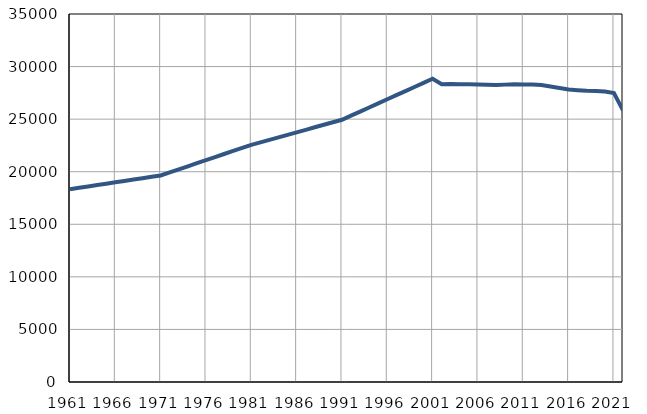
| Category | Број
становника |
|---|---|
| 1961.0 | 18336 |
| 1962.0 | 18467 |
| 1963.0 | 18597 |
| 1964.0 | 18728 |
| 1965.0 | 18859 |
| 1966.0 | 18990 |
| 1967.0 | 19120 |
| 1968.0 | 19251 |
| 1969.0 | 19382 |
| 1970.0 | 19512 |
| 1971.0 | 19643 |
| 1972.0 | 19934 |
| 1973.0 | 20226 |
| 1974.0 | 20516 |
| 1975.0 | 20809 |
| 1976.0 | 21100 |
| 1977.0 | 21391 |
| 1978.0 | 21683 |
| 1979.0 | 21974 |
| 1980.0 | 22266 |
| 1981.0 | 22557 |
| 1982.0 | 22795 |
| 1983.0 | 23033 |
| 1984.0 | 23272 |
| 1985.0 | 23510 |
| 1986.0 | 23748 |
| 1987.0 | 23986 |
| 1988.0 | 24225 |
| 1989.0 | 24463 |
| 1990.0 | 24701 |
| 1991.0 | 24939 |
| 1992.0 | 25329 |
| 1993.0 | 25720 |
| 1994.0 | 26110 |
| 1995.0 | 26500 |
| 1996.0 | 26890 |
| 1997.0 | 27281 |
| 1998.0 | 27671 |
| 1999.0 | 28061 |
| 2000.0 | 28451 |
| 2001.0 | 28842 |
| 2002.0 | 28320 |
| 2003.0 | 28336 |
| 2004.0 | 28311 |
| 2005.0 | 28309 |
| 2006.0 | 28300 |
| 2007.0 | 28273 |
| 2008.0 | 28246 |
| 2009.0 | 28283 |
| 2010.0 | 28308 |
| 2011.0 | 28287 |
| 2012.0 | 28296 |
| 2013.0 | 28244 |
| 2014.0 | 28098 |
| 2015.0 | 27955 |
| 2016.0 | 27830 |
| 2017.0 | 27757 |
| 2018.0 | 27703 |
| 2019.0 | 27676 |
| 2020.0 | 27629 |
| 2021.0 | 27487 |
| 2022.0 | 25828 |